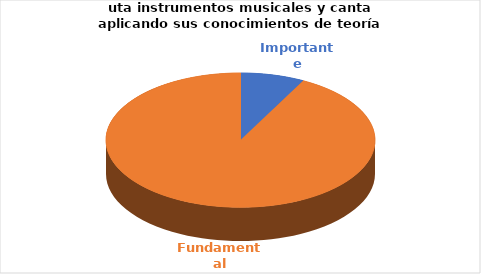
| Category | Series 0 |
|---|---|
| Importante | 1 |
| Fundamental | 12 |